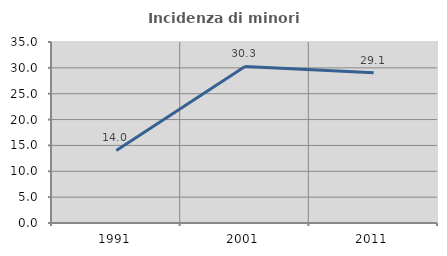
| Category | Incidenza di minori stranieri |
|---|---|
| 1991.0 | 14.035 |
| 2001.0 | 30.272 |
| 2011.0 | 29.071 |